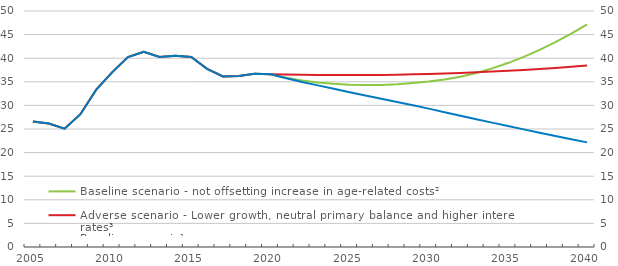
| Category | Baseline scenario - not offsetting increase in age-related costs² | Adverse scenario - Lower growth, neutral primary balance and higher interest rates³ |
|---|---|---|
| 2005.0 | 26.584 | 26.584 |
| 2006.0 | 26.156 | 26.156 |
| 2007.0 | 25.057 | 25.057 |
| 2008.0 | 28.131 | 28.131 |
| 2009.0 | 33.342 | 33.342 |
| 2010.0 | 36.997 | 36.997 |
| 2011.0 | 40.25 | 40.25 |
| 2012.0 | 41.334 | 41.334 |
| 2013.0 | 40.273 | 40.273 |
| 2014.0 | 40.538 | 40.538 |
| 2015.0 | 40.251 | 40.251 |
| 2016.0 | 37.739 | 37.739 |
| 2017.0 | 36.12 | 36.12 |
| 2018.0 | 36.254 | 36.254 |
| 2019.0 | 36.68 | 36.68 |
| 2020.0 | 36.593 | 36.593 |
| 2021.0 | 35.855 | 36.525 |
| 2022.0 | 35.284 | 36.473 |
| 2023.0 | 34.875 | 36.438 |
| 2024.0 | 34.577 | 36.42 |
| 2025.0 | 34.391 | 36.419 |
| 2026.0 | 34.315 | 36.434 |
| 2027.0 | 34.348 | 36.466 |
| 2028.0 | 34.489 | 36.514 |
| 2029.0 | 34.738 | 36.58 |
| 2030.0 | 35.043 | 36.662 |
| 2031.0 | 35.477 | 36.761 |
| 2032.0 | 36.088 | 36.877 |
| 2033.0 | 36.875 | 37.011 |
| 2034.0 | 37.836 | 37.162 |
| 2035.0 | 38.97 | 37.331 |
| 2036.0 | 40.275 | 37.517 |
| 2037.0 | 41.75 | 37.721 |
| 2038.0 | 43.392 | 37.944 |
| 2039.0 | 45.201 | 38.186 |
| 2040.0 | 47.175 | 38.447 |